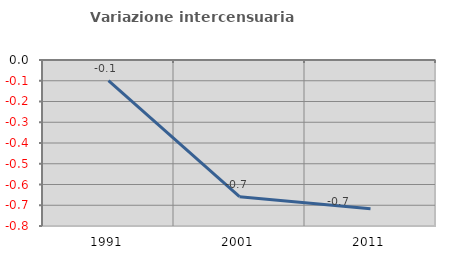
| Category | Variazione intercensuaria annua |
|---|---|
| 1991.0 | -0.099 |
| 2001.0 | -0.659 |
| 2011.0 | -0.716 |